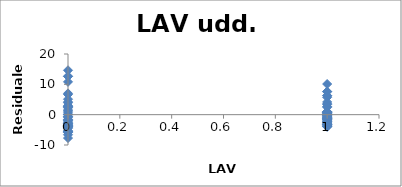
| Category | Series 0 |
|---|---|
| 1.0 | -3.343 |
| 0.0 | 14.641 |
| 1.0 | -1.358 |
| 1.0 | -1.268 |
| 1.0 | 1.025 |
| 1.0 | -2.253 |
| 1.0 | -3.163 |
| 1.0 | 7.544 |
| 0.0 | -2.833 |
| 0.0 | 2.619 |
| 0.0 | -5.525 |
| 0.0 | -3.464 |
| 1.0 | -1.163 |
| 1.0 | -0.004 |
| 0.0 | 12.656 |
| 0.0 | 6.656 |
| 0.0 | 10.814 |
| 1.0 | 3.371 |
| 0.0 | -2.073 |
| 1.0 | 0.627 |
| 0.0 | 5.107 |
| 1.0 | -0.095 |
| 1.0 | -1.448 |
| 0.0 | 4.19 |
| 1.0 | -3.697 |
| 1.0 | -3.163 |
| 0.0 | 7.024 |
| 0.0 | 3.934 |
| 1.0 | 6.206 |
| 0.0 | -3.886 |
| 1.0 | -3.704 |
| 0.0 | -4.096 |
| 1.0 | 4.183 |
| 1.0 | -3.975 |
| 0.0 | -7.705 |
| 0.0 | 1.536 |
| 0.0 | -4.006 |
| 1.0 | 2.469 |
| 1.0 | -0.802 |
| 0.0 | -3.103 |
| 0.0 | -2.54 |
| 1.0 | -3.163 |
| 0.0 | 0.566 |
| 0.0 | -5.81 |
| 1.0 | -3.884 |
| 1.0 | -2.711 |
| 1.0 | -3.343 |
| 1.0 | -0.163 |
| 1.0 | -1.787 |
| 1.0 | 0.447 |
| 1.0 | -0.982 |
| 1.0 | -0.095 |
| 0.0 | 3.017 |
| 0.0 | 12.656 |
| 0.0 | -5.359 |
| 0.0 | -0.54 |
| 1.0 | -0.185 |
| 1.0 | 0.845 |
| 1.0 | 0.266 |
| 0.0 | -4.006 |
| 0.0 | -1.998 |
| 0.0 | -0.637 |
| 1.0 | -3.072 |
| 0.0 | -0.923 |
| 0.0 | -5.449 |
| 1.0 | 10.101 |
| 0.0 | -3.006 |
| 0.0 | -1.622 |
| 1.0 | 6.296 |
| 1.0 | -0.907 |
| 1.0 | 0.176 |
| 1.0 | -2.336 |
| 0.0 | 2.641 |
| 1.0 | 0.627 |
| 1.0 | 0.808 |
| 0.0 | -4.457 |
| 1.0 | 7.664 |
| 1.0 | -0.095 |
| 1.0 | 5.717 |
| 1.0 | -0.456 |
| 1.0 | -2.794 |
| 1.0 | 0.837 |
| 1.0 | 0.845 |
| 1.0 | -1.343 |
| 1.0 | 2.664 |
| 0.0 | 0.024 |
| 0.0 | 2.528 |
| 0.0 | 1.19 |
| 0.0 | -1.532 |
| 1.0 | -0.726 |
| 0.0 | 0.002 |
| 0.0 | -3.449 |
| 1.0 | -3.975 |
| 0.0 | -5.893 |
| 1.0 | -1.629 |
| 0.0 | -3.547 |
| 1.0 | 0.935 |
| 0.0 | -6.622 |
| 1.0 | -0.456 |
| 1.0 | 3.574 |
| 1.0 | -2.065 |
| 0.0 | 2.28 |
| 1.0 | -1.629 |